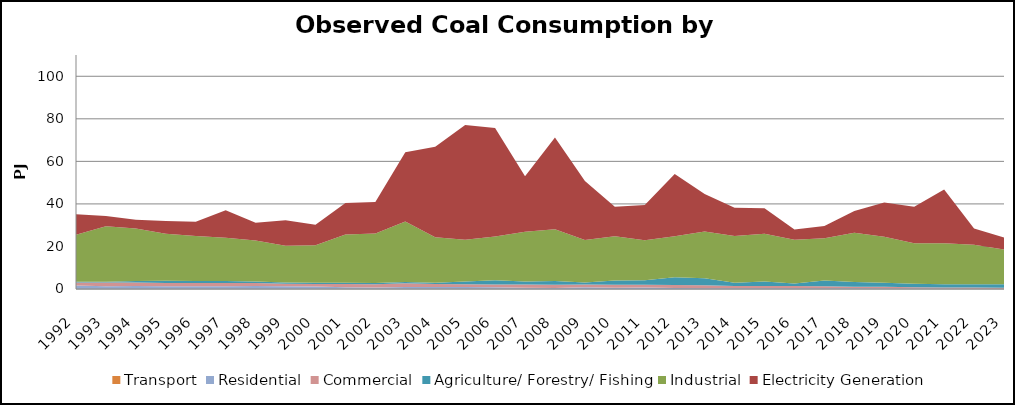
| Category |  Transport  |  Residential  |  Commercial  |  Agriculture/ Forestry/ Fishing  |  Industrial  |  Electricity Generation  |
|---|---|---|---|---|---|---|
| 1992.0 | 0.08 | 1.532 | 1.445 | 0.352 | 22.095 | 9.68 |
| 1993.0 | 0.08 | 1.239 | 1.7 | 0.371 | 26.144 | 4.725 |
| 1994.0 | 0.08 | 1.276 | 1.653 | 0.718 | 24.739 | 4.12 |
| 1995.0 | 0.08 | 1.259 | 1.523 | 0.995 | 22.058 | 6.041 |
| 1996.0 | 0.08 | 1.202 | 1.483 | 1.031 | 21.173 | 6.619 |
| 1997.0 | 0.08 | 1.252 | 1.469 | 0.912 | 20.351 | 12.901 |
| 1998.0 | 0.08 | 1.309 | 1.419 | 0.758 | 19.288 | 8.258 |
| 1999.0 | 0.08 | 1.167 | 1.263 | 0.488 | 17.283 | 12.011 |
| 2000.0 | 0.08 | 1.081 | 1.247 | 0.584 | 17.528 | 9.687 |
| 2001.0 | 0.08 | 0.721 | 1.56 | 0.587 | 22.657 | 14.831 |
| 2002.0 | 0.08 | 0.605 | 1.506 | 0.626 | 23.242 | 14.868 |
| 2003.0 | 0.08 | 0.824 | 1.818 | 0.554 | 28.433 | 32.529 |
| 2004.0 | 0.08 | 0.867 | 1.422 | 0.533 | 21.425 | 42.582 |
| 2005.0 | 0.08 | 0.88 | 1.325 | 1.223 | 19.671 | 53.943 |
| 2006.0 | 0.08 | 0.686 | 1.393 | 1.982 | 20.569 | 50.986 |
| 2007.0 | 0.08 | 0.55 | 1.46 | 1.462 | 23.34 | 26.067 |
| 2008.0 | 0.08 | 0.363 | 1.584 | 1.737 | 24.309 | 43.094 |
| 2009.0 | 0.019 | 0.855 | 1.289 | 0.841 | 20.085 | 27.621 |
| 2010.0 | 0.047 | 0.531 | 1.445 | 1.945 | 20.819 | 13.834 |
| 2011.0 | 0.039 | 0.725 | 1.291 | 2.116 | 18.756 | 16.506 |
| 2012.0 | 0.021 | 0.474 | 1.417 | 3.599 | 19.253 | 29.323 |
| 2013.0 | 0.012 | 0.332 | 1.464 | 3.226 | 22.045 | 17.564 |
| 2014.0 | 0.015 | 0.346 | 1.002 | 1.586 | 21.997 | 13.217 |
| 2015.0 | 0.011 | 0.39 | 0.993 | 2.084 | 22.484 | 11.995 |
| 2016.0 | 0.002 | 0.343 | 1.082 | 1.165 | 20.584 | 4.845 |
| 2017.0 | 0 | 0.296 | 0.995 | 2.707 | 19.906 | 5.681 |
| 2018.0 | 0 | 0.314 | 0.773 | 2.156 | 23.16 | 10.214 |
| 2019.0 | 0 | 0.234 | 0.798 | 1.895 | 21.629 | 16.083 |
| 2020.0 | 0 | 0.272 | 0.566 | 1.607 | 19.102 | 17.162 |
| 2021.0 | 0 | 0.237 | 0.489 | 1.516 | 19.319 | 25.245 |
| 2022.0 | 0 | 0.15 | 0.533 | 1.514 | 18.587 | 7.708 |
| 2023.0 | 0 | 0.129 | 0.49 | 1.612 | 16.348 | 5.684 |